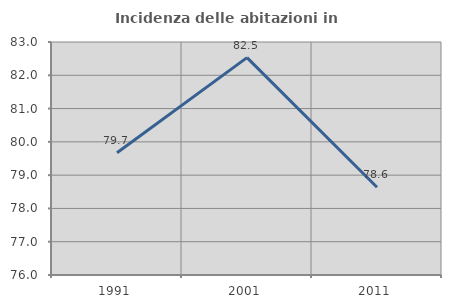
| Category | Incidenza delle abitazioni in proprietà  |
|---|---|
| 1991.0 | 79.672 |
| 2001.0 | 82.53 |
| 2011.0 | 78.636 |